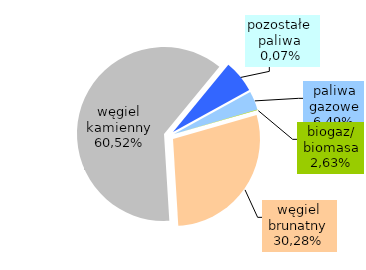
| Category | Series 0 |
|---|---|
| węgiel brunatny | 39780.419 |
| węgiel kamienny | 86551 |
| paliwa gazowe | 8397.281 |
| biogaz/biomasa | 4823.201 |
| pozostałe paliwa | 167.195 |